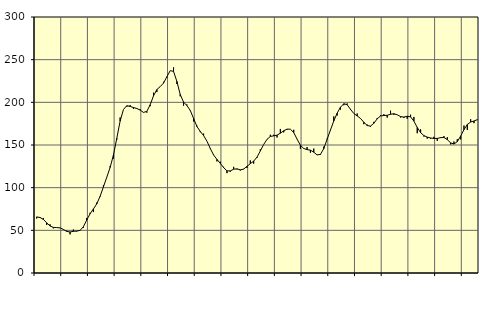
| Category | Piggar | Series 1 |
|---|---|---|
| nan | 63.9 | 65.74 |
| 87.0 | 65.5 | 65.05 |
| 87.0 | 64.5 | 62.82 |
| 87.0 | 56.3 | 58.82 |
| nan | 57.1 | 55.05 |
| 88.0 | 52.3 | 53.47 |
| 88.0 | 53.4 | 53.23 |
| 88.0 | 52.8 | 52.88 |
| nan | 51.4 | 51.08 |
| 89.0 | 49.6 | 48.73 |
| 89.0 | 45.3 | 48.09 |
| 89.0 | 50.9 | 48.81 |
| nan | 48.7 | 49.19 |
| 90.0 | 49.6 | 49.9 |
| 90.0 | 53.1 | 54.28 |
| 90.0 | 64.5 | 62.09 |
| nan | 70.6 | 69.43 |
| 91.0 | 71.4 | 75.02 |
| 91.0 | 82.5 | 81.06 |
| 91.0 | 89.3 | 89.84 |
| nan | 102.8 | 100.93 |
| 92.0 | 112 | 112.19 |
| 92.0 | 125.1 | 123.67 |
| 92.0 | 134.2 | 138.2 |
| nan | 156.2 | 157.85 |
| 93.0 | 182.2 | 178.07 |
| 93.0 | 191.6 | 191.6 |
| 93.0 | 194.9 | 196 |
| nan | 196.7 | 195.24 |
| 94.0 | 192.3 | 193.87 |
| 94.0 | 192.5 | 192.81 |
| 94.0 | 191.9 | 190.87 |
| nan | 188 | 188.2 |
| 95.0 | 187.9 | 189.4 |
| 95.0 | 195.5 | 197.18 |
| 95.0 | 211.3 | 207.61 |
| nan | 212 | 214.95 |
| 96.0 | 218.3 | 218.42 |
| 96.0 | 224 | 222.52 |
| 96.0 | 229 | 229.96 |
| nan | 237.1 | 237.13 |
| 97.0 | 240.9 | 236.27 |
| 97.0 | 221.5 | 224.5 |
| 97.0 | 207.1 | 209.27 |
| nan | 196.1 | 200.23 |
| 98.0 | 197.5 | 196.33 |
| 98.0 | 190.2 | 190.55 |
| 98.0 | 177.6 | 181.19 |
| nan | 172.7 | 171.66 |
| 99.0 | 165 | 165.94 |
| 99.0 | 163.3 | 161.05 |
| 99.0 | 154.5 | 154.5 |
| nan | 145.5 | 145.99 |
| 0.0 | 138.7 | 138.29 |
| 0.0 | 130.8 | 133.11 |
| 0.0 | 130.4 | 128.6 |
| nan | 124.4 | 123.46 |
| 1.0 | 117 | 119.69 |
| 1.0 | 118.7 | 119.64 |
| 1.0 | 124.4 | 121.61 |
| nan | 121.5 | 122.06 |
| 2.0 | 120.1 | 120.9 |
| 2.0 | 122 | 121.75 |
| 2.0 | 123.1 | 124.96 |
| nan | 131.9 | 128.14 |
| 3.0 | 128.2 | 131.12 |
| 3.0 | 135 | 135.76 |
| 3.0 | 144.9 | 143.04 |
| nan | 150.6 | 150.64 |
| 4.0 | 156.4 | 156.62 |
| 4.0 | 162 | 160.02 |
| 4.0 | 162 | 160.73 |
| nan | 158.8 | 161.53 |
| 5.0 | 168.8 | 163.83 |
| 5.0 | 164.8 | 166.68 |
| 5.0 | 168.2 | 168.62 |
| nan | 168.5 | 168.52 |
| 6.0 | 167.8 | 164.63 |
| 6.0 | 157.1 | 156.9 |
| 6.0 | 145.4 | 149.75 |
| nan | 146.2 | 145.93 |
| 7.0 | 147.6 | 144.56 |
| 7.0 | 141 | 143.98 |
| 7.0 | 145.8 | 141.58 |
| nan | 138.2 | 138.4 |
| 8.0 | 138.4 | 138.95 |
| 8.0 | 148.1 | 145.74 |
| 8.0 | 157.5 | 156.68 |
| nan | 167.3 | 167.51 |
| 9.0 | 183.5 | 178.18 |
| 9.0 | 184.5 | 187.23 |
| 9.0 | 191.5 | 194.29 |
| nan | 196.6 | 198.36 |
| 10.0 | 198.7 | 197.21 |
| 10.0 | 191.1 | 191.87 |
| 10.0 | 186.8 | 186.89 |
| nan | 186.9 | 184.09 |
| 11.0 | 181.3 | 181.13 |
| 11.0 | 174.4 | 176.72 |
| 11.0 | 174 | 172.82 |
| nan | 171.2 | 172.14 |
| 12.0 | 177.1 | 175.45 |
| 12.0 | 181.7 | 180.63 |
| 12.0 | 185 | 184.01 |
| nan | 186.1 | 184.57 |
| 13.0 | 182.1 | 184.83 |
| 13.0 | 190.2 | 186.01 |
| 13.0 | 185.3 | 186.64 |
| nan | 185.3 | 185.39 |
| 14.0 | 182.2 | 183.34 |
| 14.0 | 181.6 | 182.71 |
| 14.0 | 180.7 | 183.75 |
| nan | 185.5 | 182.97 |
| 15.0 | 182.9 | 177.97 |
| 15.0 | 163.8 | 170.59 |
| 15.0 | 168.3 | 164.49 |
| nan | 159.9 | 161 |
| 16.0 | 157.4 | 159.24 |
| 16.0 | 157.4 | 158.23 |
| 16.0 | 159.6 | 157.68 |
| nan | 154.9 | 157.71 |
| 17.0 | 158.2 | 158.62 |
| 17.0 | 160.4 | 158.86 |
| 17.0 | 159.1 | 156.28 |
| nan | 150.7 | 152.55 |
| 18.0 | 154.1 | 151.14 |
| 18.0 | 156.8 | 153.93 |
| 18.0 | 156.6 | 160.42 |
| nan | 172.8 | 167.94 |
| 19.0 | 167.6 | 174.05 |
| 19.0 | 180.2 | 176.91 |
| 19.0 | 175.6 | 178.14 |
| nan | 179.2 | 179.69 |